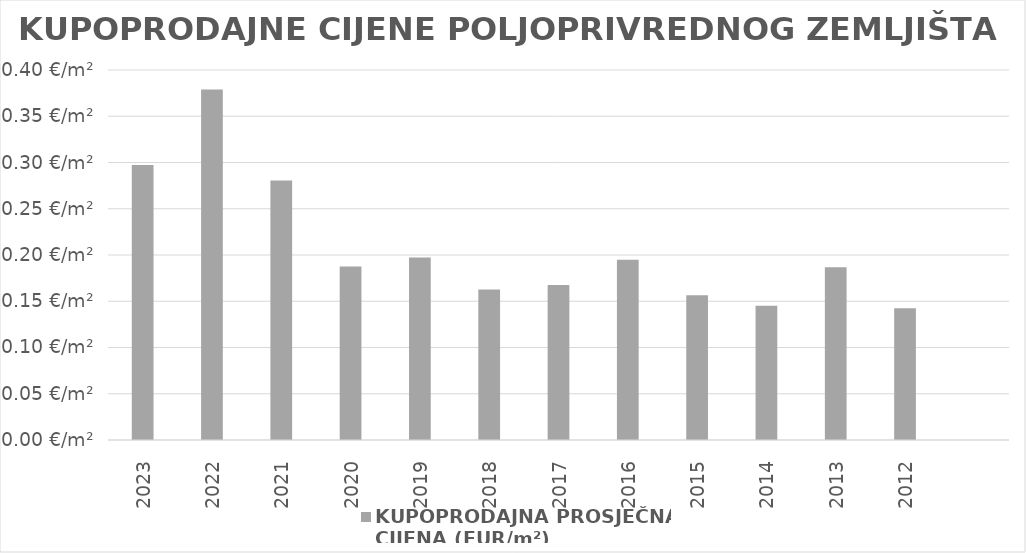
| Category | KUPOPRODAJNA PROSJEČNA 
CIJENA (EUR/m²) |
|---|---|
| 2023 | 0.297 |
| 2022 | 0.379 |
| 2021 | 0.28 |
| 2020 | 0.188 |
| 2019 | 0.197 |
| 2018 | 0.163 |
| 2017 | 0.168 |
| 2016 | 0.195 |
| 2015 | 0.156 |
| 2014 | 0.145 |
| 2013 | 0.187 |
| 2012 | 0.142 |